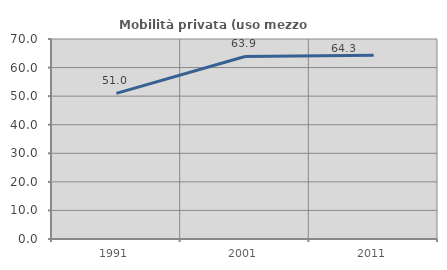
| Category | Mobilità privata (uso mezzo privato) |
|---|---|
| 1991.0 | 50.975 |
| 2001.0 | 63.878 |
| 2011.0 | 64.339 |